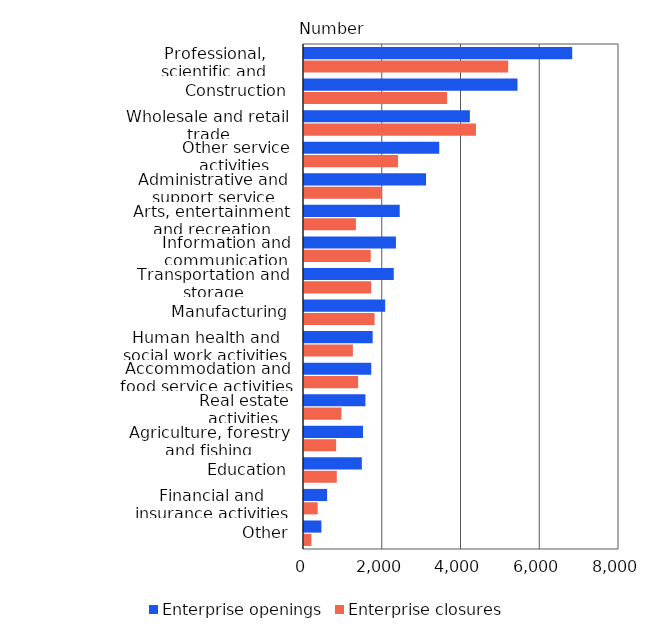
| Category | Enterprise openings | Enterprise closures |
|---|---|---|
| Professional, scientific and technical activities | 6812 | 5185 |
| Construction | 5422 | 3635 |
| Wholesale and retail trade | 4213 | 4367 |
| Other service activities | 3435 | 2388 |
| Administrative and support service activities | 3100 | 1965 |
| Arts, entertainment and recreation | 2431 | 1318 |
| Information and communication | 2335 | 1695 |
| Transportation and storage | 2280 | 1706 |
| Manufacturing | 2062 | 1793 |
| Human health and social work activities | 1744 | 1241 |
| Accommodation and food service activities | 1708 | 1374 |
| Real estate activities | 1560 | 950 |
| Agriculture, forestry and fishing | 1499 | 817 |
| Education | 1469 | 833 |
| Financial and insurance activities | 587 | 347 |
| Other | 442 | 187 |